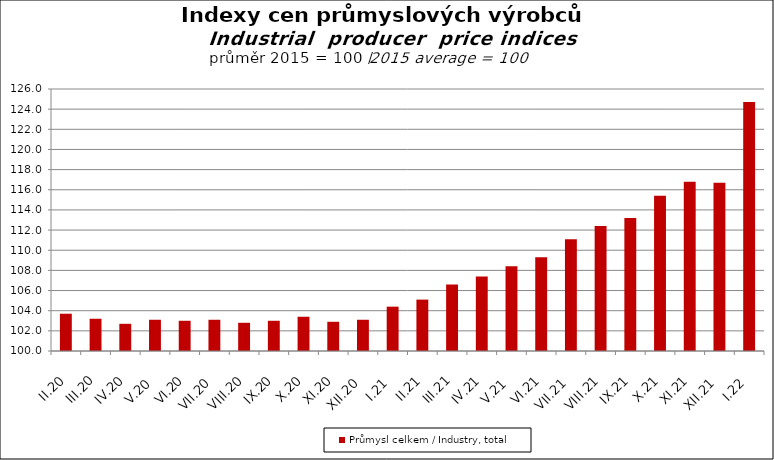
| Category | Průmysl celkem / Industry, total |
|---|---|
| II.20 | 103.7 |
| III.20 | 103.2 |
| IV.20 | 102.7 |
| V.20 | 103.1 |
| VI.20 | 103 |
| VII.20 | 103.1 |
| VIII.20 | 102.8 |
| IX.20 | 103 |
| X.20 | 103.4 |
| XI.20 | 102.9 |
| XII.20 | 103.1 |
| I.21 | 104.4 |
| II.21 | 105.1 |
| III.21 | 106.6 |
| IV.21 | 107.4 |
| V.21 | 108.4 |
| VI.21 | 109.3 |
| VII.21 | 111.1 |
| VIII.21 | 112.4 |
| IX.21 | 113.2 |
| X.21 | 115.4 |
| XI.21 | 116.8 |
| XII.21 | 116.7 |
| I.22 | 124.7 |